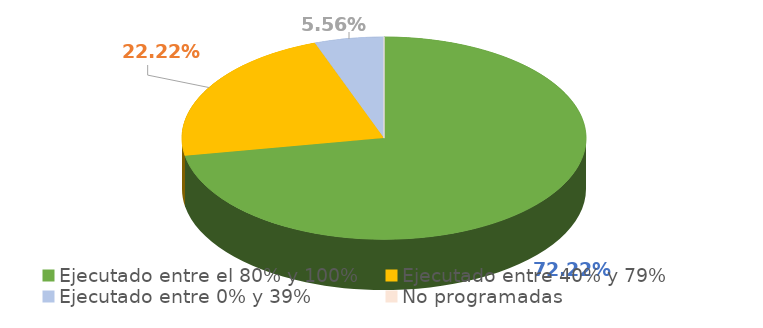
| Category | Series 0 |
|---|---|
| Ejecutado entre el 80% y 100% | 0.722 |
| Ejecutado entre 40% y 79% | 0.222 |
| Ejecutado entre 0% y 39% | 0.056 |
| No programadas | 0 |